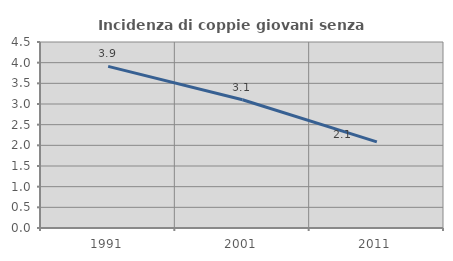
| Category | Incidenza di coppie giovani senza figli |
|---|---|
| 1991.0 | 3.909 |
| 2001.0 | 3.104 |
| 2011.0 | 2.084 |